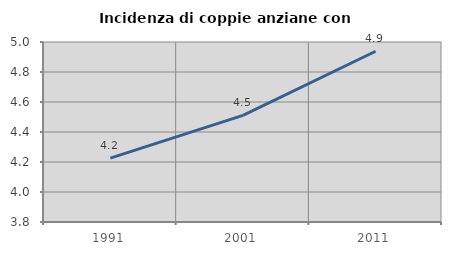
| Category | Incidenza di coppie anziane con figli |
|---|---|
| 1991.0 | 4.225 |
| 2001.0 | 4.511 |
| 2011.0 | 4.938 |